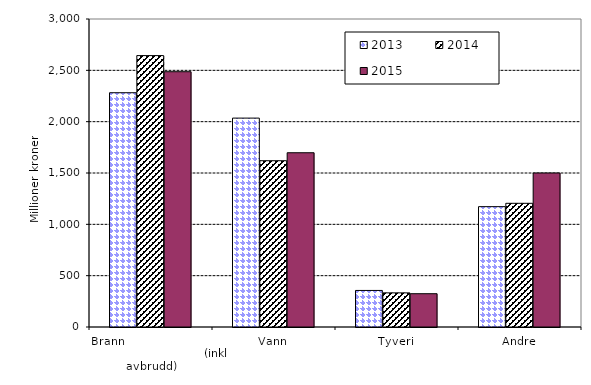
| Category | 2013 | 2014 | 2015 |
|---|---|---|---|
| Brann                                                       (inkl avbrudd) | 2281.891 | 2643.683 | 2486.577 |
| Vann | 2034.663 | 1619.639 | 1697.321 |
| Tyveri | 356.034 | 332.484 | 324.222 |
| Andre | 1172.209 | 1204.755 | 1500.007 |